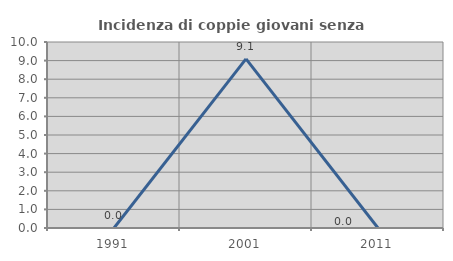
| Category | Incidenza di coppie giovani senza figli |
|---|---|
| 1991.0 | 0 |
| 2001.0 | 9.091 |
| 2011.0 | 0 |